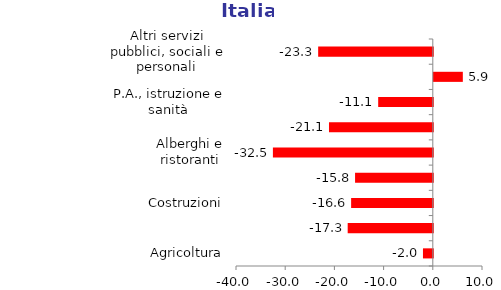
| Category | Italia |
|---|---|
| Agricoltura | -2 |
| Industria in senso stretto | -17.3 |
| Costruzioni | -16.6 |
| Commercio e riparazioni | -15.8 |
| Alberghi e ristoranti | -32.5 |
| Trasporti, comunicazioni etc. | -21.1 |
| P.A., istruzione e sanità | -11.1 |
| Attività svolte da famiglie e convivenze | 5.9 |
| Altri servizi pubblici, sociali e personali | -23.3 |